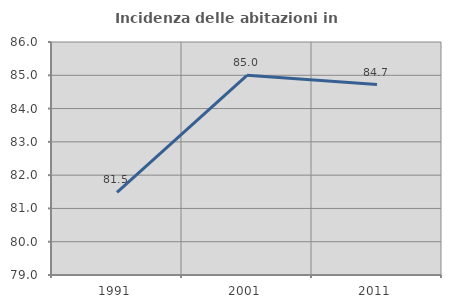
| Category | Incidenza delle abitazioni in proprietà  |
|---|---|
| 1991.0 | 81.481 |
| 2001.0 | 85 |
| 2011.0 | 84.722 |